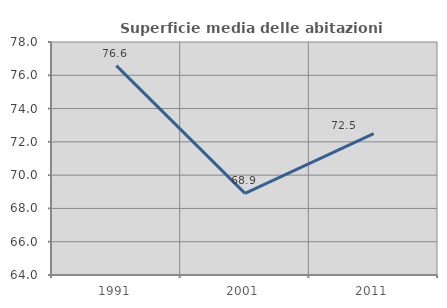
| Category | Superficie media delle abitazioni occupate |
|---|---|
| 1991.0 | 76.58 |
| 2001.0 | 68.901 |
| 2011.0 | 72.49 |